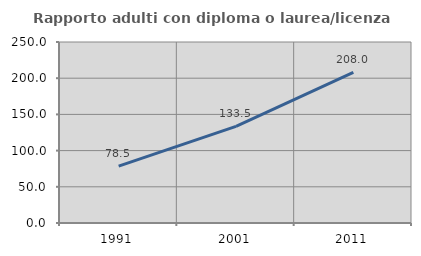
| Category | Rapporto adulti con diploma o laurea/licenza media  |
|---|---|
| 1991.0 | 78.493 |
| 2001.0 | 133.461 |
| 2011.0 | 208.039 |